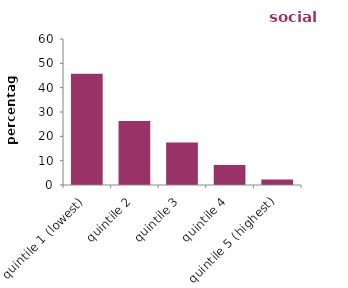
| Category | social renters |
|---|---|
| quintile 1 (lowest) | 45.77 |
| quintile 2 | 26.3 |
| quintile 3 | 17.478 |
| quintile 4 | 8.175 |
| quintile 5 (highest) | 2.278 |